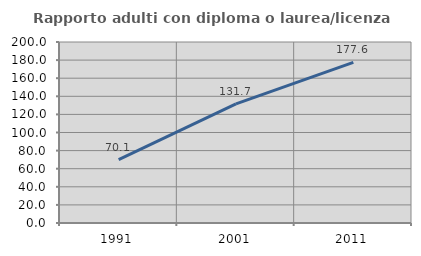
| Category | Rapporto adulti con diploma o laurea/licenza media  |
|---|---|
| 1991.0 | 70.14 |
| 2001.0 | 131.685 |
| 2011.0 | 177.563 |